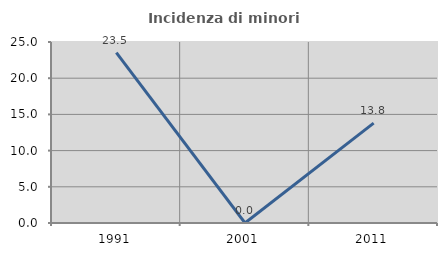
| Category | Incidenza di minori stranieri |
|---|---|
| 1991.0 | 23.529 |
| 2001.0 | 0 |
| 2011.0 | 13.793 |